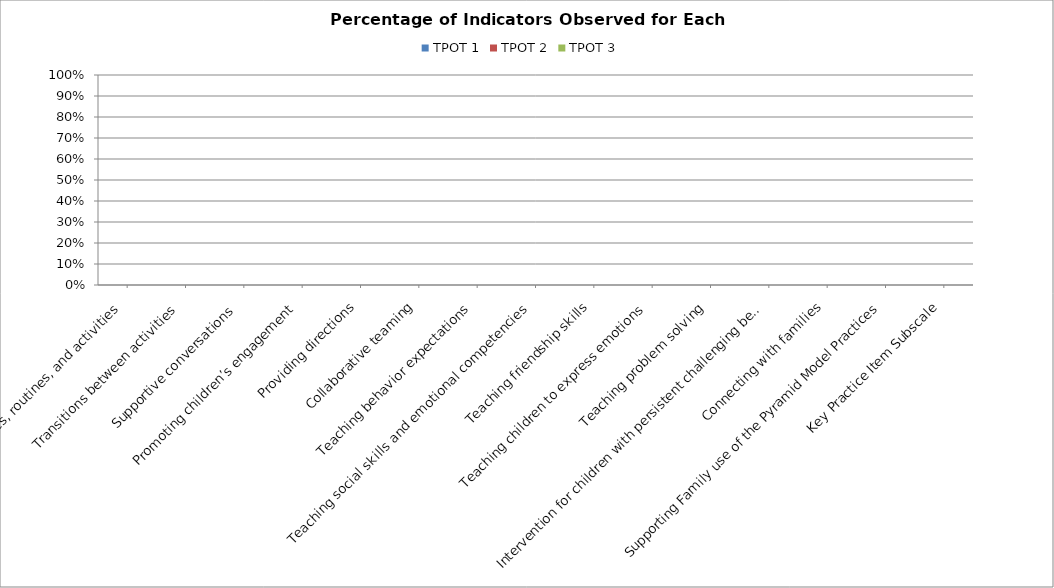
| Category | TPOT 1 | TPOT 2 | TPOT 3 |
|---|---|---|---|
| Schedules, routines, and activities | 0 | 0 | 0 |
| Transitions between activities  | 0 | 0 | 0 |
| Supportive conversations  | 0 | 0 | 0 |
| Promoting children’s engagement | 0 | 0 | 0 |
| Providing directions | 0 | 0 | 0 |
| Collaborative teaming | 0 | 0 | 0 |
| Teaching behavior expectations | 0 | 0 | 0 |
| Teaching social skills and emotional competencies | 0 | 0 | 0 |
| Teaching friendship skills | 0 | 0 | 0 |
| Teaching children to express emotions | 0 | 0 | 0 |
| Teaching problem solving | 0 | 0 | 0 |
| Intervention for children with persistent challenging behavior | 0 | 0 | 0 |
| Connecting with families | 0 | 0 | 0 |
| Supporting Family use of the Pyramid Model Practices | 0 | 0 | 0 |
| Key Practice Item Subscale | 0 | 0 | 0 |